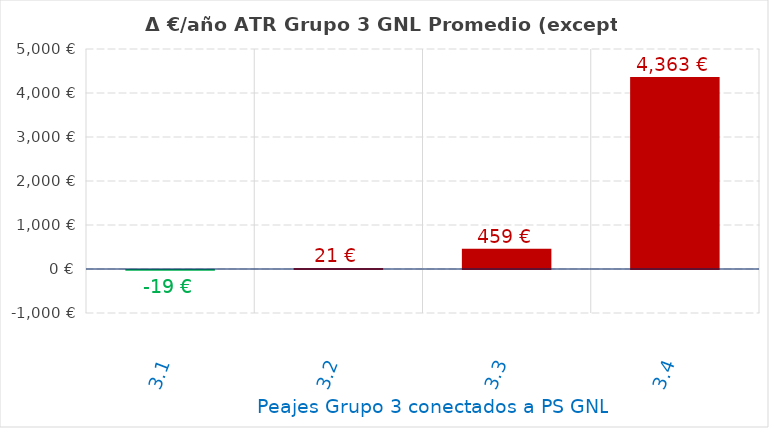
| Category | D €/año |
|---|---|
| 3.1 | -18.762 |
| 3.2 | 20.606 |
| 3.3 | 459.025 |
| 3.4 | 4363.087 |